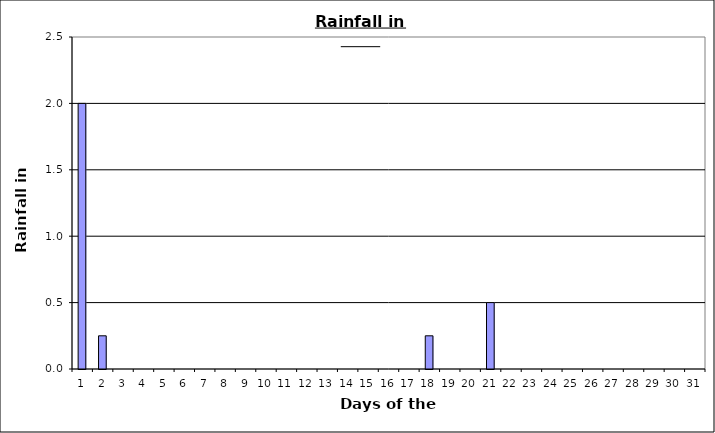
| Category | Series 0 |
|---|---|
| 0 | 2 |
| 1 | 0.25 |
| 2 | 0 |
| 3 | 0 |
| 4 | 0 |
| 5 | 0 |
| 6 | 0 |
| 7 | 0 |
| 8 | 0 |
| 9 | 0 |
| 10 | 0 |
| 11 | 0 |
| 12 | 0 |
| 13 | 0 |
| 14 | 0 |
| 15 | 0 |
| 16 | 0 |
| 17 | 0.25 |
| 18 | 0 |
| 19 | 0 |
| 20 | 0.5 |
| 21 | 0 |
| 22 | 0 |
| 23 | 0 |
| 24 | 0 |
| 25 | 0 |
| 26 | 0 |
| 27 | 0 |
| 28 | 0 |
| 29 | 0 |
| 30 | 0 |